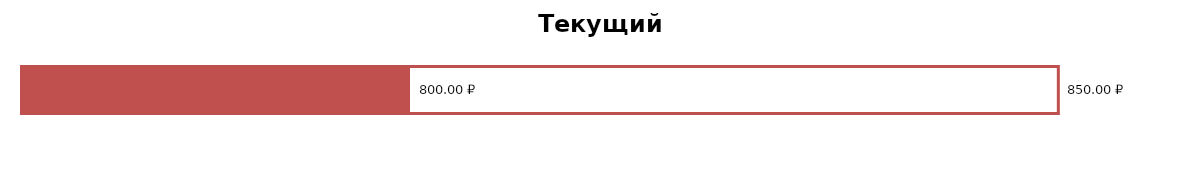
| Category | Series 0 | Series 1 |
|---|---|---|
| 0 | 850 | 800 |